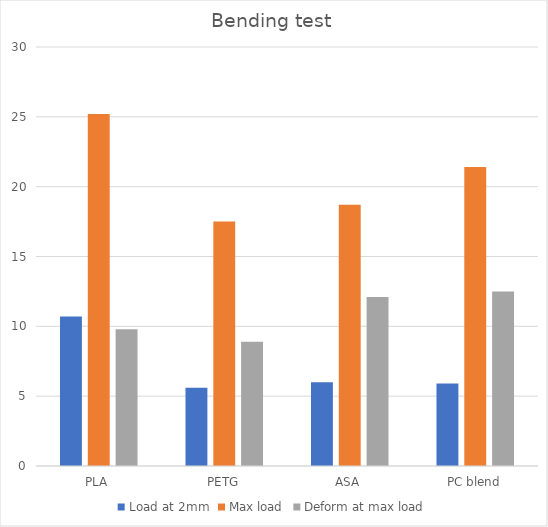
| Category | Load at 2mm | Max load | Deform at max load |
|---|---|---|---|
| PLA | 10.7 | 25.2 | 9.8 |
| PETG | 5.6 | 17.5 | 8.9 |
| ASA | 6 | 18.7 | 12.1 |
| PC blend | 5.9 | 21.4 | 12.5 |